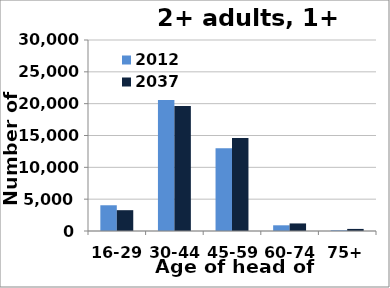
| Category | 2012 | 2037 |
|---|---|---|
| 16-29 | 4043 | 3269 |
| 30-44 | 20576 | 19614 |
| 45-59 | 12982 | 14590 |
| 60-74 | 895 | 1188 |
| 75+ | 112 | 327 |